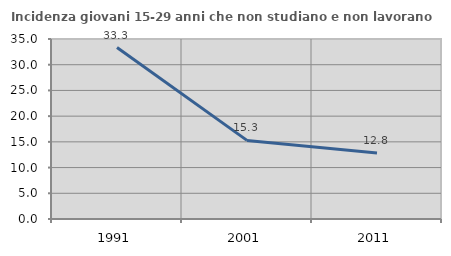
| Category | Incidenza giovani 15-29 anni che non studiano e non lavorano  |
|---|---|
| 1991.0 | 33.333 |
| 2001.0 | 15.285 |
| 2011.0 | 12.844 |